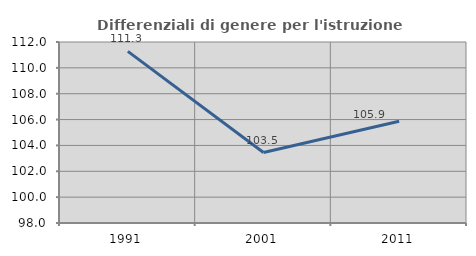
| Category | Differenziali di genere per l'istruzione superiore |
|---|---|
| 1991.0 | 111.275 |
| 2001.0 | 103.451 |
| 2011.0 | 105.867 |